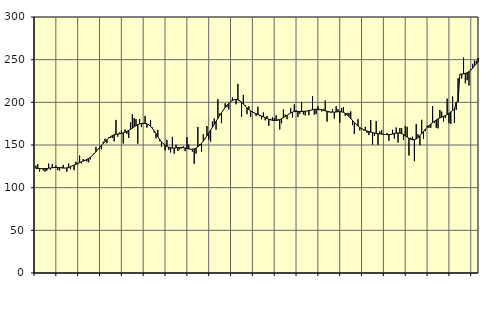
| Category | Piggar | Series 1 |
|---|---|---|
| nan | 125.8 | 122.56 |
| 1.0 | 127.6 | 122.56 |
| 1.0 | 118.8 | 122.42 |
| 1.0 | 121.9 | 122.25 |
| 1.0 | 120.3 | 122.22 |
| 1.0 | 118.7 | 122.3 |
| 1.0 | 119.8 | 122.47 |
| 1.0 | 128.2 | 122.77 |
| 1.0 | 121 | 123.06 |
| 1.0 | 127.7 | 123.35 |
| 1.0 | 124.1 | 123.57 |
| 1.0 | 125.9 | 123.68 |
| nan | 120.6 | 123.64 |
| 2.0 | 120 | 123.44 |
| 2.0 | 124.1 | 123.18 |
| 2.0 | 126.7 | 122.98 |
| 2.0 | 122.9 | 122.95 |
| 2.0 | 118.8 | 123.18 |
| 2.0 | 128.3 | 123.71 |
| 2.0 | 121.7 | 124.52 |
| 2.0 | 126 | 125.49 |
| 2.0 | 120.5 | 126.54 |
| 2.0 | 130.4 | 127.56 |
| 2.0 | 127.3 | 128.5 |
| nan | 137.5 | 129.38 |
| 3.0 | 128.5 | 130.25 |
| 3.0 | 133.6 | 131.14 |
| 3.0 | 132.5 | 132.06 |
| 3.0 | 130.8 | 133.1 |
| 3.0 | 129.8 | 134.35 |
| 3.0 | 133.2 | 135.86 |
| 3.0 | 137.5 | 137.66 |
| 3.0 | 140.5 | 139.8 |
| 3.0 | 147.8 | 142.14 |
| 3.0 | 144.9 | 144.6 |
| 3.0 | 145.8 | 147.07 |
| nan | 145.1 | 149.46 |
| 4.0 | 153.9 | 151.79 |
| 4.0 | 157.5 | 154.02 |
| 4.0 | 152.1 | 156.1 |
| 4.0 | 159.1 | 158.03 |
| 4.0 | 158.6 | 159.7 |
| 4.0 | 158.2 | 161.06 |
| 4.0 | 154.2 | 162 |
| 4.0 | 179.4 | 162.54 |
| 4.0 | 159.8 | 162.89 |
| 4.0 | 164.7 | 163.19 |
| 4.0 | 166.8 | 163.6 |
| nan | 151.8 | 164.21 |
| 5.0 | 168.1 | 164.99 |
| 5.0 | 163.1 | 165.95 |
| 5.0 | 158.3 | 167.12 |
| 5.0 | 176.3 | 168.43 |
| 5.0 | 186 | 169.81 |
| 5.0 | 181.7 | 171.21 |
| 5.0 | 180.4 | 172.59 |
| 5.0 | 151.7 | 173.77 |
| 5.0 | 180.3 | 174.64 |
| 5.0 | 171 | 175.23 |
| 5.0 | 174.9 | 175.48 |
| nan | 184.1 | 175.35 |
| 6.0 | 170.4 | 174.75 |
| 6.0 | 174.2 | 173.58 |
| 6.0 | 179.3 | 171.84 |
| 6.0 | 170.5 | 169.48 |
| 6.0 | 164.5 | 166.54 |
| 6.0 | 157.9 | 163.23 |
| 6.0 | 167.7 | 159.81 |
| 6.0 | 154.5 | 156.61 |
| 6.0 | 147.9 | 153.85 |
| 6.0 | 152.1 | 151.54 |
| 6.0 | 143.7 | 149.77 |
| nan | 156 | 148.41 |
| 7.0 | 144.3 | 147.41 |
| 7.0 | 141.3 | 146.77 |
| 7.0 | 159.5 | 146.42 |
| 7.0 | 139.9 | 146.39 |
| 7.0 | 150.3 | 146.63 |
| 7.0 | 142.9 | 146.92 |
| 7.0 | 144.8 | 147.08 |
| 7.0 | 146 | 147.07 |
| 7.0 | 148.4 | 146.86 |
| 7.0 | 142.8 | 146.49 |
| 7.0 | 159.2 | 145.96 |
| nan | 150.5 | 145.42 |
| 8.0 | 145.4 | 145.08 |
| 8.0 | 142.1 | 145.09 |
| 8.0 | 128 | 145.45 |
| 8.0 | 140 | 146.28 |
| 8.0 | 171.1 | 147.67 |
| 8.0 | 151 | 149.58 |
| 8.0 | 142 | 151.97 |
| 8.0 | 162.5 | 154.76 |
| 8.0 | 157.3 | 157.79 |
| 8.0 | 172.3 | 160.94 |
| 8.0 | 156.4 | 164.17 |
| nan | 154 | 167.43 |
| 9.0 | 177.5 | 170.73 |
| 9.0 | 181.1 | 174.14 |
| 9.0 | 168 | 177.69 |
| 9.0 | 203.7 | 181.24 |
| 9.0 | 187 | 184.62 |
| 9.0 | 175.6 | 187.88 |
| 9.0 | 190.9 | 191.01 |
| 9.0 | 198.8 | 193.94 |
| 9.0 | 194.4 | 196.57 |
| 9.0 | 191.6 | 198.85 |
| 9.0 | 200.5 | 200.74 |
| nan | 205.7 | 202.22 |
| 10.0 | 203.6 | 203.13 |
| 10.0 | 197.7 | 203.35 |
| 10.0 | 221.6 | 202.85 |
| 10.0 | 202.1 | 201.72 |
| 10.0 | 183 | 200.04 |
| 10.0 | 208.7 | 197.99 |
| 10.0 | 196.9 | 195.77 |
| 10.0 | 186.2 | 193.58 |
| 10.0 | 195.3 | 191.62 |
| 10.0 | 183.2 | 190 |
| 10.0 | 189.7 | 188.7 |
| nan | 187.9 | 187.63 |
| 11.0 | 183.9 | 186.67 |
| 11.0 | 194.8 | 185.77 |
| 11.0 | 183.8 | 184.88 |
| 11.0 | 180.2 | 183.99 |
| 11.0 | 188.1 | 183.1 |
| 11.0 | 178.9 | 182.17 |
| 11.0 | 184 | 181.18 |
| 11.0 | 172.6 | 180.26 |
| 11.0 | 180.6 | 179.48 |
| 11.0 | 182.3 | 178.93 |
| 11.0 | 181.3 | 178.66 |
| nan | 184.7 | 178.7 |
| 12.0 | 180 | 179.06 |
| 12.0 | 168.3 | 179.78 |
| 12.0 | 175.4 | 180.75 |
| 12.0 | 191.7 | 181.96 |
| 12.0 | 185.6 | 183.34 |
| 12.0 | 180.2 | 184.79 |
| 12.0 | 185.8 | 186.24 |
| 12.0 | 193.3 | 187.54 |
| 12.0 | 182.4 | 188.52 |
| 12.0 | 197.5 | 189.11 |
| 12.0 | 190.7 | 189.38 |
| nan | 182.8 | 189.41 |
| 13.0 | 186.5 | 189.36 |
| 13.0 | 200.5 | 189.35 |
| 13.0 | 185.8 | 189.46 |
| 13.0 | 184.6 | 189.61 |
| 13.0 | 189.7 | 189.85 |
| 13.0 | 184.9 | 190.25 |
| 13.0 | 190.4 | 190.76 |
| 13.0 | 207.2 | 191.26 |
| 13.0 | 185.7 | 191.67 |
| 13.0 | 186.2 | 191.91 |
| 13.0 | 195.4 | 191.87 |
| nan | 190.9 | 191.67 |
| 14.0 | 189.4 | 191.3 |
| 14.0 | 192.3 | 190.75 |
| 14.0 | 202.1 | 190.1 |
| 14.0 | 177.4 | 189.51 |
| 14.0 | 188.3 | 189.03 |
| 14.0 | 187.9 | 188.68 |
| 14.0 | 192.3 | 188.51 |
| 14.0 | 181 | 188.54 |
| 14.0 | 195.4 | 188.73 |
| 14.0 | 192.1 | 188.97 |
| 14.0 | 176.2 | 189.09 |
| nan | 193.4 | 188.89 |
| 15.0 | 194.5 | 188.27 |
| 15.0 | 184.1 | 187.13 |
| 15.0 | 187.6 | 185.47 |
| 15.0 | 187.6 | 183.43 |
| 15.0 | 189.4 | 181.13 |
| 15.0 | 173.3 | 178.72 |
| 15.0 | 162.9 | 176.37 |
| 15.0 | 174 | 174.15 |
| 15.0 | 180.2 | 172.2 |
| 15.0 | 167.1 | 170.56 |
| 15.0 | 169.8 | 169.22 |
| nan | 167.2 | 168.16 |
| 16.0 | 171.4 | 167.25 |
| 16.0 | 164.3 | 166.44 |
| 16.0 | 161.6 | 165.75 |
| 16.0 | 179.3 | 165.11 |
| 16.0 | 150.6 | 164.49 |
| 16.0 | 160.7 | 163.96 |
| 16.0 | 178 | 163.55 |
| 16.0 | 150.1 | 163.27 |
| 16.0 | 165.9 | 163.01 |
| 16.0 | 167.5 | 162.73 |
| 16.0 | 162.8 | 162.51 |
| nan | 162.3 | 162.33 |
| 17.0 | 163.9 | 162.16 |
| 17.0 | 155 | 162.17 |
| 17.0 | 162 | 162.41 |
| 17.0 | 167.9 | 162.81 |
| 17.0 | 157.5 | 163.36 |
| 17.0 | 170.5 | 163.91 |
| 17.0 | 152.9 | 164.15 |
| 17.0 | 169.9 | 163.99 |
| 17.0 | 169.6 | 163.35 |
| 17.0 | 156.2 | 162.24 |
| 17.0 | 172.3 | 160.81 |
| nan | 171.3 | 159.27 |
| 18.0 | 137.7 | 157.86 |
| 18.0 | 158.5 | 156.83 |
| 18.0 | 159.7 | 156.27 |
| 18.0 | 131 | 156.3 |
| 18.0 | 174.7 | 157.06 |
| 18.0 | 162.7 | 158.61 |
| 18.0 | 149.8 | 160.75 |
| 18.0 | 179.5 | 163.26 |
| 18.0 | 157.3 | 165.87 |
| 18.0 | 166.2 | 168.42 |
| 18.0 | 172.7 | 170.69 |
| nan | 170.1 | 172.65 |
| 19.0 | 170.2 | 174.48 |
| 19.0 | 195.5 | 176.2 |
| 19.0 | 176 | 177.8 |
| 19.0 | 170.2 | 179.36 |
| 19.0 | 169.5 | 180.71 |
| 19.0 | 191 | 181.75 |
| 19.0 | 189.1 | 182.67 |
| 19.0 | 177.6 | 183.52 |
| 19.0 | 181.8 | 184.43 |
| 19.0 | 204.3 | 185.63 |
| 19.0 | 175.6 | 187.15 |
| nan | 174.6 | 188.84 |
| 20.0 | 206.9 | 190.47 |
| 20.0 | 175.9 | 191.82 |
| 20.0 | 191 | 200.2 |
| 20.0 | 228.3 | 200.83 |
| 20.0 | 232.8 | 232.95 |
| 20.0 | 228 | 233.21 |
| 20.0 | 252.4 | 233.47 |
| 20.0 | 222.3 | 233.95 |
| 20.0 | 225.9 | 234.81 |
| 20.0 | 219.8 | 236.09 |
| 20.0 | 238.9 | 237.81 |
| nan | 245.1 | 240 |
| 21.0 | 248.9 | 242.48 |
| 21.0 | 248.6 | 245.02 |
| 21.0 | 251.8 | 247.47 |